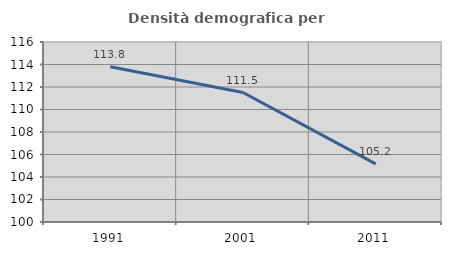
| Category | Densità demografica |
|---|---|
| 1991.0 | 113.807 |
| 2001.0 | 111.509 |
| 2011.0 | 105.162 |